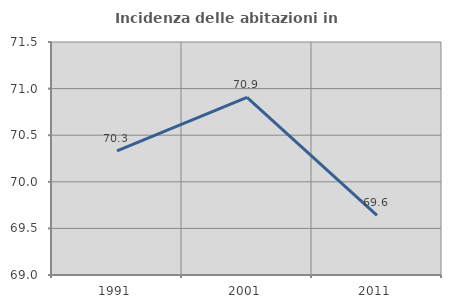
| Category | Incidenza delle abitazioni in proprietà  |
|---|---|
| 1991.0 | 70.333 |
| 2001.0 | 70.905 |
| 2011.0 | 69.641 |